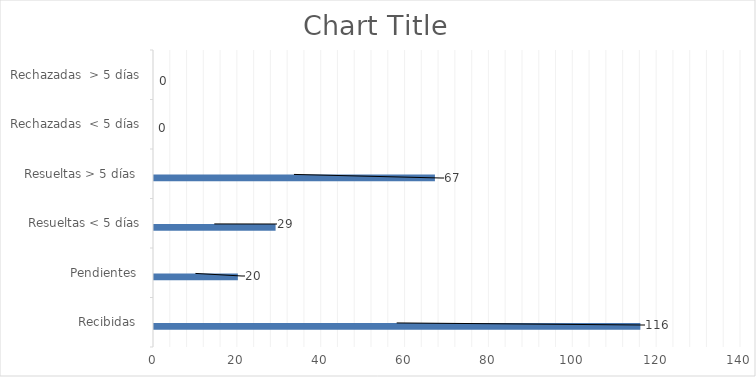
| Category | Física | PORTAL SAIP | 311 | Otras |
|---|---|---|---|---|
| Recibidas  | 0 | 116 | 0 | 0 |
| Pendientes  | 0 | 20 | 0 | 0 |
| Resueltas < 5 días | 0 | 29 | 0 | 0 |
| Resueltas > 5 días  | 0 | 67 | 0 | 0 |
| Rechazadas  < 5 días | 0 | 0 | 0 | 0 |
| Rechazadas  > 5 días | 0 | 0 | 0 | 0 |